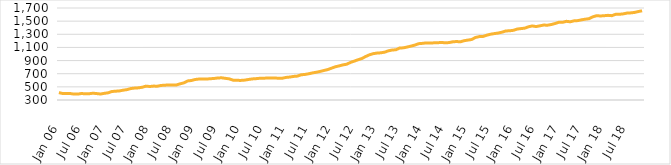
| Category | Total délivrance ACS |
|---|---|
| 2006-01-31 | 412.241 |
| 2006-02-28 | 398.675 |
| 2006-03-31 | 399.46 |
| 2006-04-30 | 398.195 |
| 2006-05-31 | 389.81 |
| 2006-06-30 | 390.276 |
| 2006-07-31 | 399.058 |
| 2006-08-31 | 393.389 |
| 2006-09-30 | 395.595 |
| 2006-10-31 | 403.275 |
| 2006-11-30 | 397.6 |
| 2006-12-31 | 391.33 |
| 2007-01-31 | 401.213 |
| 2007-02-28 | 409.354 |
| 2007-03-31 | 429.396 |
| 2007-04-30 | 433.838 |
| 2007-05-31 | 438.68 |
| 2007-06-30 | 449.42 |
| 2007-07-31 | 458.258 |
| 2007-08-31 | 474.488 |
| 2007-09-30 | 481.43 |
| 2007-10-31 | 485.023 |
| 2007-11-30 | 493.8 |
| 2007-12-31 | 511.119 |
| 2008-01-31 | 505.326 |
| 2008-02-29 | 511.401 |
| 2008-03-31 | 510.395 |
| 2008-04-30 | 521.385 |
| 2008-05-31 | 525.117 |
| 2008-06-30 | 529.791 |
| 2008-07-31 | 527.837 |
| 2008-08-31 | 527.713 |
| 2008-09-30 | 546.155 |
| 2008-10-31 | 560.319 |
| 2008-11-30 | 590.306 |
| 2008-12-31 | 596.626 |
| 2009-01-31 | 612.439 |
| 2009-02-28 | 618.852 |
| 2009-03-31 | 619.555 |
| 2009-04-30 | 619.074 |
| 2009-05-31 | 623.857 |
| 2009-06-30 | 627.796 |
| 2009-07-31 | 635.893 |
| 2009-08-31 | 637.303 |
| 2009-09-30 | 629.121 |
| 2009-10-31 | 621.698 |
| 2009-11-30 | 601.558 |
| 2009-12-31 | 599.623 |
| 2010-01-31 | 597.897 |
| 2010-02-28 | 602.328 |
| 2010-03-31 | 611.796 |
| 2010-04-30 | 620.602 |
| 2010-05-31 | 624.434 |
| 2010-06-30 | 630.432 |
| 2010-07-31 | 630.937 |
| 2010-08-31 | 634.984 |
| 2010-09-30 | 634.554 |
| 2010-10-31 | 632.926 |
| 2010-11-30 | 632.801 |
| 2010-12-31 | 631.493 |
| 2011-01-31 | 643.62 |
| 2011-02-28 | 649.399 |
| 2011-03-31 | 658.868 |
| 2011-04-30 | 663.692 |
| 2011-05-31 | 683.817 |
| 2011-06-30 | 689.216 |
| 2011-07-31 | 699.46 |
| 2011-08-31 | 712.655 |
| 2011-09-30 | 722.071 |
| 2011-10-31 | 734.751 |
| 2011-11-30 | 749.51 |
| 2011-12-31 | 763.079 |
| 2012-01-31 | 784.575 |
| 2012-02-29 | 805.562 |
| 2012-03-31 | 818.8 |
| 2012-04-30 | 834.316 |
| 2012-05-31 | 844.577 |
| 2012-06-30 | 871.964 |
| 2012-07-31 | 891.922 |
| 2012-08-31 | 912.508 |
| 2012-09-30 | 931.587 |
| 2012-10-31 | 961.569 |
| 2012-11-30 | 987.663 |
| 2012-12-31 | 1005.161 |
| 2013-01-31 | 1014.209 |
| 2013-02-28 | 1017.968 |
| 2013-03-31 | 1027.693 |
| 2013-04-30 | 1048.171 |
| 2013-05-31 | 1060.464 |
| 2013-06-30 | 1064.499 |
| 2013-07-31 | 1091.674 |
| 2013-08-31 | 1093.804 |
| 2013-09-30 | 1106.611 |
| 2013-10-31 | 1120.519 |
| 2013-11-30 | 1135.679 |
| 2013-12-31 | 1157.178 |
| 2014-01-31 | 1161.852 |
| 2014-02-28 | 1169.165 |
| 2014-03-31 | 1168.219 |
| 2014-04-30 | 1169.444 |
| 2014-05-31 | 1170.953 |
| 2014-06-30 | 1176.73 |
| 2014-07-31 | 1169.691 |
| 2014-08-31 | 1173.78 |
| 2014-09-30 | 1185.252 |
| 2014-10-31 | 1189.934 |
| 2014-11-30 | 1185.269 |
| 2014-12-31 | 1202.29 |
| 2015-01-31 | 1211.618 |
| 2015-02-28 | 1220.829 |
| 2015-03-31 | 1251.523 |
| 2015-04-30 | 1264.744 |
| 2015-05-31 | 1266.958 |
| 2015-06-30 | 1286.25 |
| 2015-07-31 | 1301.434 |
| 2015-08-31 | 1310.766 |
| 2015-09-30 | 1318.798 |
| 2015-10-31 | 1332.126 |
| 2015-11-30 | 1350.926 |
| 2015-12-31 | 1352.871 |
| 2016-01-31 | 1360.432 |
| 2016-02-29 | 1379.411 |
| 2016-03-31 | 1386.62 |
| 2016-04-30 | 1392.989 |
| 2016-05-31 | 1414.269 |
| 2016-06-30 | 1427.035 |
| 2016-07-31 | 1417.061 |
| 2016-08-31 | 1428.561 |
| 2016-09-30 | 1440.15 |
| 2016-10-31 | 1438.467 |
| 2016-11-30 | 1448.182 |
| 2016-12-31 | 1463.641 |
| 2017-01-31 | 1482.832 |
| 2017-02-28 | 1482.118 |
| 2017-03-31 | 1497.386 |
| 2017-04-30 | 1489.99 |
| 2017-05-31 | 1504.466 |
| 2017-06-30 | 1508.008 |
| 2017-07-31 | 1520.106 |
| 2017-08-31 | 1529.752 |
| 2017-09-30 | 1537.746 |
| 2017-10-31 | 1565.856 |
| 2017-11-30 | 1583.02 |
| 2017-12-31 | 1578.768 |
| 2018-01-31 | 1582.858 |
| 2018-02-28 | 1588.22 |
| 2018-03-31 | 1583.435 |
| 2018-04-30 | 1603.246 |
| 2018-05-31 | 1604.496 |
| 2018-06-30 | 1610.403 |
| 2018-07-31 | 1622.588 |
| 2018-08-31 | 1625.915 |
| 2018-09-30 | 1632.557 |
| 2018-10-31 | 1646.016 |
| 2018-11-30 | 1657.63 |